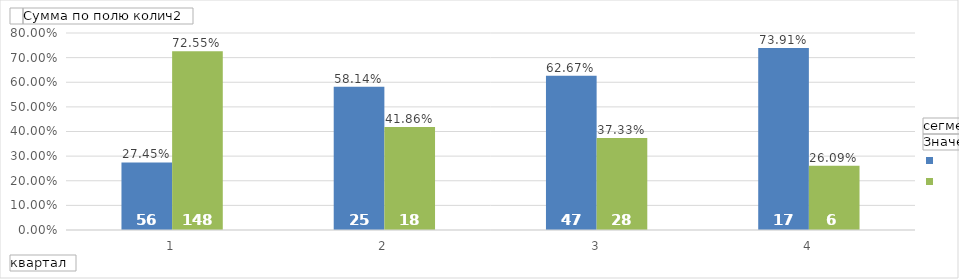
| Category | активный2017 -   | отказник2018 -   |
|---|---|---|
| 1 | 0.275 | 0.725 |
| 2 | 0.581 | 0.419 |
| 3 | 0.627 | 0.373 |
| 4 | 0.739 | 0.261 |